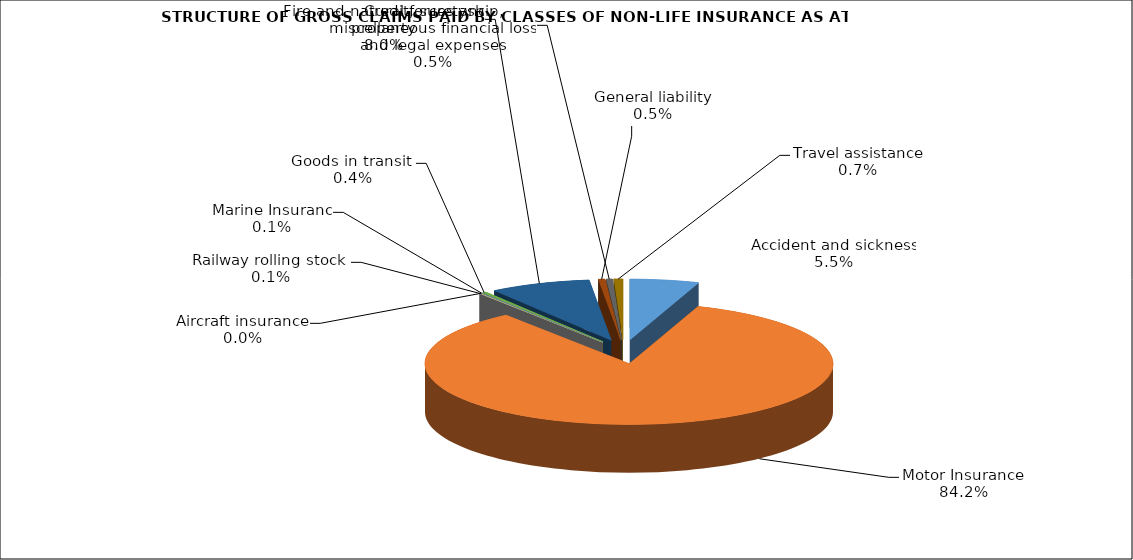
| Category | Accident and sickness | Series 1 |
|---|---|---|
| Accident and sickness | 0.055 |  |
| Motor Insurance | 0.842 |  |
| Railway rolling stock  | 0.001 |  |
| Aircraft insurance | 0 |  |
| Marine Insuranc | 0.001 |  |
| Goods in transit  | 0.004 |  |
| Fire and natural forces and property | 0.08 |  |
| General liability | 0.005 |  |
| Credit, suretyship, miscellaneous financial loss and legal expenses | 0.005 |  |
| Travel assistance | 0.007 |  |